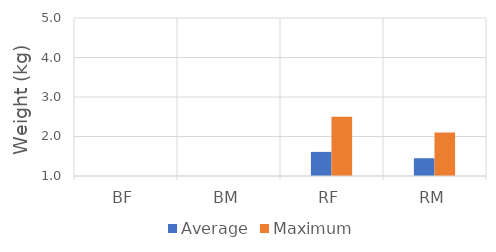
| Category | Average | Maximum |
|---|---|---|
| BF | 0 | 0 |
| BM | 0 | 0 |
| RF | 1.61 | 2.5 |
| RM | 1.45 | 2.1 |